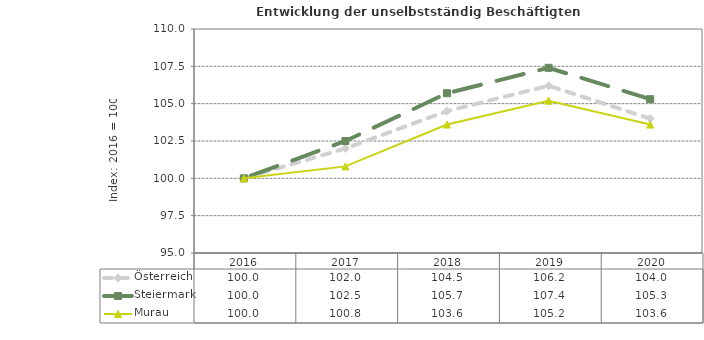
| Category | Österreich | Steiermark | Murau |
|---|---|---|---|
| 2020.0 | 104 | 105.3 | 103.6 |
| 2019.0 | 106.2 | 107.4 | 105.2 |
| 2018.0 | 104.5 | 105.7 | 103.6 |
| 2017.0 | 102 | 102.5 | 100.8 |
| 2016.0 | 100 | 100 | 100 |